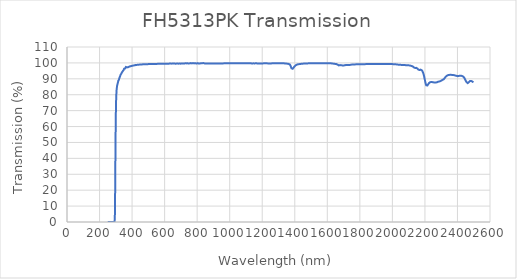
| Category | Transmission |
|---|---|
| 250.0 | 0.008 |
| 251.0 | 0.009 |
| 252.0 | 0.008 |
| 253.0 | 0.008 |
| 254.0 | 0.008 |
| 255.0 | 0.008 |
| 256.0 | 0.007 |
| 257.0 | 0.008 |
| 258.0 | 0.007 |
| 259.0 | 0.008 |
| 260.0 | 0.009 |
| 261.0 | 0.009 |
| 262.0 | 0.009 |
| 263.0 | 0.01 |
| 264.0 | 0.009 |
| 265.0 | 0.011 |
| 266.0 | 0.007 |
| 267.0 | 0.008 |
| 268.0 | 0.008 |
| 269.0 | 0.01 |
| 270.0 | 0.009 |
| 271.0 | 0.008 |
| 272.0 | 0.009 |
| 273.0 | 0.009 |
| 274.0 | 0.008 |
| 275.0 | 0.01 |
| 276.0 | 0.009 |
| 277.0 | 0.009 |
| 278.0 | 0.008 |
| 279.0 | 0.009 |
| 280.0 | 0.009 |
| 281.0 | 0.008 |
| 282.0 | 0.009 |
| 283.0 | 0.008 |
| 284.0 | 0.01 |
| 285.0 | 0.009 |
| 286.0 | 0.008 |
| 287.0 | 0.009 |
| 288.0 | 0.01 |
| 289.0 | 0.01 |
| 290.0 | 0.01 |
| 291.0 | 0.009 |
| 292.0 | 0.029 |
| 293.0 | 0.375 |
| 294.0 | 2.529 |
| 295.0 | 8.987 |
| 296.0 | 19.893 |
| 297.0 | 33.569 |
| 298.0 | 46.509 |
| 299.0 | 57.641 |
| 300.0 | 66.242 |
| 301.0 | 72.44 |
| 302.0 | 76.669 |
| 303.0 | 79.618 |
| 304.0 | 81.58 |
| 305.0 | 83.037 |
| 306.0 | 84.03 |
| 307.0 | 84.977 |
| 308.0 | 85.71 |
| 309.0 | 85.952 |
| 310.0 | 86.551 |
| 311.0 | 87 |
| 312.0 | 87.38 |
| 313.0 | 87.763 |
| 314.0 | 88.084 |
| 315.0 | 88.718 |
| 316.0 | 88.637 |
| 317.0 | 89.262 |
| 318.0 | 89.281 |
| 319.0 | 89.429 |
| 320.0 | 89.93 |
| 321.0 | 90.235 |
| 322.0 | 90.444 |
| 323.0 | 90.657 |
| 324.0 | 90.974 |
| 325.0 | 91.132 |
| 326.0 | 91.437 |
| 327.0 | 91.865 |
| 328.0 | 92.211 |
| 329.0 | 92.385 |
| 330.0 | 92.602 |
| 331.0 | 92.775 |
| 332.0 | 92.926 |
| 333.0 | 92.98 |
| 334.0 | 93.304 |
| 335.0 | 93.339 |
| 336.0 | 93.663 |
| 337.0 | 93.593 |
| 338.0 | 93.794 |
| 339.0 | 94.243 |
| 340.0 | 94.324 |
| 341.0 | 94.56 |
| 342.0 | 94.769 |
| 343.0 | 94.569 |
| 344.0 | 94.99 |
| 345.0 | 95.25 |
| 346.0 | 95.195 |
| 347.0 | 95.5 |
| 348.0 | 95.229 |
| 349.0 | 95.684 |
| 350.0 | 95.807 |
| 351.0 | 96.322 |
| 352.0 | 96.282 |
| 353.0 | 95.983 |
| 354.0 | 96.245 |
| 355.0 | 96.355 |
| 356.0 | 96.371 |
| 357.0 | 96.386 |
| 358.0 | 96.56 |
| 359.0 | 96.713 |
| 360.0 | 96.704 |
| 361.0 | 96.887 |
| 362.0 | 97.423 |
| 363.0 | 97.019 |
| 364.0 | 96.943 |
| 365.0 | 97.003 |
| 366.0 | 96.871 |
| 367.0 | 97.106 |
| 368.0 | 97.286 |
| 369.0 | 97.177 |
| 370.0 | 97.295 |
| 371.0 | 97.392 |
| 372.0 | 97.353 |
| 373.0 | 97.274 |
| 374.0 | 97.318 |
| 375.0 | 97.623 |
| 376.0 | 97.287 |
| 377.0 | 97.519 |
| 378.0 | 97.654 |
| 379.0 | 97.677 |
| 380.0 | 97.728 |
| 381.0 | 97.564 |
| 382.0 | 97.797 |
| 383.0 | 97.671 |
| 384.0 | 97.756 |
| 385.0 | 97.745 |
| 386.0 | 97.913 |
| 387.0 | 97.835 |
| 388.0 | 97.919 |
| 389.0 | 98.024 |
| 390.0 | 97.932 |
| 391.0 | 97.963 |
| 392.0 | 98.077 |
| 393.0 | 97.958 |
| 394.0 | 97.964 |
| 395.0 | 98.021 |
| 396.0 | 98.194 |
| 397.0 | 98.07 |
| 398.0 | 98.143 |
| 399.0 | 98.218 |
| 400.0 | 98.145 |
| 401.0 | 98.239 |
| 402.0 | 98.188 |
| 403.0 | 98.189 |
| 404.0 | 98.255 |
| 405.0 | 98.285 |
| 406.0 | 98.291 |
| 407.0 | 98.358 |
| 408.0 | 98.527 |
| 409.0 | 98.472 |
| 410.0 | 98.437 |
| 411.0 | 98.422 |
| 412.0 | 98.392 |
| 413.0 | 98.433 |
| 414.0 | 98.47 |
| 415.0 | 98.503 |
| 416.0 | 98.393 |
| 417.0 | 98.631 |
| 418.0 | 98.566 |
| 419.0 | 98.706 |
| 420.0 | 98.625 |
| 421.0 | 98.51 |
| 422.0 | 98.732 |
| 423.0 | 98.612 |
| 424.0 | 98.669 |
| 425.0 | 98.755 |
| 426.0 | 98.74 |
| 427.0 | 98.727 |
| 428.0 | 98.683 |
| 429.0 | 98.774 |
| 430.0 | 98.788 |
| 431.0 | 98.767 |
| 432.0 | 98.767 |
| 433.0 | 98.756 |
| 434.0 | 98.779 |
| 435.0 | 98.801 |
| 436.0 | 98.882 |
| 437.0 | 98.834 |
| 438.0 | 98.839 |
| 439.0 | 98.887 |
| 440.0 | 98.946 |
| 441.0 | 98.868 |
| 442.0 | 98.886 |
| 443.0 | 98.923 |
| 444.0 | 98.981 |
| 445.0 | 98.989 |
| 446.0 | 98.934 |
| 447.0 | 98.918 |
| 448.0 | 99.007 |
| 449.0 | 98.945 |
| 450.0 | 98.987 |
| 451.0 | 98.923 |
| 452.0 | 98.958 |
| 453.0 | 98.974 |
| 454.0 | 98.948 |
| 455.0 | 99.01 |
| 456.0 | 98.948 |
| 457.0 | 98.999 |
| 458.0 | 98.993 |
| 459.0 | 98.965 |
| 460.0 | 99.034 |
| 461.0 | 99.054 |
| 462.0 | 99.054 |
| 463.0 | 99.084 |
| 464.0 | 99.039 |
| 465.0 | 99.022 |
| 466.0 | 99.099 |
| 467.0 | 99.138 |
| 468.0 | 98.986 |
| 469.0 | 99.013 |
| 470.0 | 99.15 |
| 471.0 | 99.036 |
| 472.0 | 99.124 |
| 473.0 | 99.122 |
| 474.0 | 99.157 |
| 475.0 | 99.08 |
| 476.0 | 99.123 |
| 477.0 | 99.161 |
| 478.0 | 99.111 |
| 479.0 | 99.15 |
| 480.0 | 99.131 |
| 481.0 | 99.136 |
| 482.0 | 99.105 |
| 483.0 | 99.11 |
| 484.0 | 99.157 |
| 485.0 | 99.235 |
| 486.0 | 99.18 |
| 487.0 | 99.088 |
| 488.0 | 99.226 |
| 489.0 | 99.175 |
| 490.0 | 99.096 |
| 491.0 | 99.19 |
| 492.0 | 99.189 |
| 493.0 | 99.22 |
| 494.0 | 99.228 |
| 495.0 | 99.189 |
| 496.0 | 99.191 |
| 497.0 | 99.181 |
| 498.0 | 99.164 |
| 499.0 | 99.296 |
| 500.0 | 99.327 |
| 501.0 | 99.252 |
| 502.0 | 99.286 |
| 503.0 | 99.298 |
| 504.0 | 99.185 |
| 505.0 | 99.183 |
| 506.0 | 99.219 |
| 507.0 | 99.303 |
| 508.0 | 99.275 |
| 509.0 | 99.249 |
| 510.0 | 99.247 |
| 511.0 | 99.318 |
| 512.0 | 99.317 |
| 513.0 | 99.258 |
| 514.0 | 99.173 |
| 515.0 | 99.254 |
| 516.0 | 99.35 |
| 517.0 | 99.322 |
| 518.0 | 99.347 |
| 519.0 | 99.261 |
| 520.0 | 99.269 |
| 521.0 | 99.338 |
| 522.0 | 99.318 |
| 523.0 | 99.287 |
| 524.0 | 99.348 |
| 525.0 | 99.326 |
| 526.0 | 99.323 |
| 527.0 | 99.347 |
| 528.0 | 99.284 |
| 529.0 | 99.279 |
| 530.0 | 99.257 |
| 531.0 | 99.3 |
| 532.0 | 99.387 |
| 533.0 | 99.321 |
| 534.0 | 99.33 |
| 535.0 | 99.413 |
| 536.0 | 99.335 |
| 537.0 | 99.249 |
| 538.0 | 99.411 |
| 539.0 | 99.393 |
| 540.0 | 99.327 |
| 541.0 | 99.351 |
| 542.0 | 99.362 |
| 543.0 | 99.322 |
| 544.0 | 99.386 |
| 545.0 | 99.298 |
| 546.0 | 99.418 |
| 547.0 | 99.356 |
| 548.0 | 99.384 |
| 549.0 | 99.379 |
| 550.0 | 99.362 |
| 551.0 | 99.343 |
| 552.0 | 99.391 |
| 553.0 | 99.347 |
| 554.0 | 99.454 |
| 555.0 | 99.317 |
| 556.0 | 99.394 |
| 557.0 | 99.404 |
| 558.0 | 99.429 |
| 559.0 | 99.399 |
| 560.0 | 99.469 |
| 561.0 | 99.397 |
| 562.0 | 99.383 |
| 563.0 | 99.496 |
| 564.0 | 99.386 |
| 565.0 | 99.474 |
| 566.0 | 99.399 |
| 567.0 | 99.513 |
| 568.0 | 99.455 |
| 569.0 | 99.362 |
| 570.0 | 99.49 |
| 571.0 | 99.426 |
| 572.0 | 99.478 |
| 573.0 | 99.409 |
| 574.0 | 99.507 |
| 575.0 | 99.367 |
| 576.0 | 99.446 |
| 577.0 | 99.49 |
| 578.0 | 99.461 |
| 579.0 | 99.419 |
| 580.0 | 99.429 |
| 581.0 | 99.402 |
| 582.0 | 99.533 |
| 583.0 | 99.547 |
| 584.0 | 99.484 |
| 585.0 | 99.473 |
| 586.0 | 99.439 |
| 587.0 | 99.43 |
| 588.0 | 99.442 |
| 589.0 | 99.42 |
| 590.0 | 99.428 |
| 591.0 | 99.471 |
| 592.0 | 99.501 |
| 593.0 | 99.436 |
| 594.0 | 99.492 |
| 595.0 | 99.446 |
| 596.0 | 99.463 |
| 597.0 | 99.546 |
| 598.0 | 99.483 |
| 599.0 | 99.476 |
| 600.0 | 99.498 |
| 601.0 | 99.521 |
| 602.0 | 99.461 |
| 603.0 | 99.448 |
| 604.0 | 99.496 |
| 605.0 | 99.512 |
| 606.0 | 99.457 |
| 607.0 | 99.53 |
| 608.0 | 99.466 |
| 609.0 | 99.565 |
| 610.0 | 99.477 |
| 611.0 | 99.503 |
| 612.0 | 99.553 |
| 613.0 | 99.562 |
| 614.0 | 99.524 |
| 615.0 | 99.503 |
| 616.0 | 99.484 |
| 617.0 | 99.516 |
| 618.0 | 99.477 |
| 619.0 | 99.536 |
| 620.0 | 99.528 |
| 621.0 | 99.514 |
| 622.0 | 99.482 |
| 623.0 | 99.537 |
| 624.0 | 99.547 |
| 625.0 | 99.535 |
| 626.0 | 99.545 |
| 627.0 | 99.489 |
| 628.0 | 99.55 |
| 629.0 | 99.549 |
| 630.0 | 99.6 |
| 631.0 | 99.567 |
| 632.0 | 99.52 |
| 633.0 | 99.567 |
| 634.0 | 99.592 |
| 635.0 | 99.597 |
| 636.0 | 99.501 |
| 637.0 | 99.545 |
| 638.0 | 99.48 |
| 639.0 | 99.557 |
| 640.0 | 99.523 |
| 641.0 | 99.554 |
| 642.0 | 99.535 |
| 643.0 | 99.615 |
| 644.0 | 99.523 |
| 645.0 | 99.531 |
| 646.0 | 99.545 |
| 647.0 | 99.585 |
| 648.0 | 99.606 |
| 649.0 | 99.583 |
| 650.0 | 99.615 |
| 651.0 | 99.565 |
| 652.0 | 99.551 |
| 653.0 | 99.537 |
| 654.0 | 99.525 |
| 655.0 | 99.555 |
| 656.0 | 99.579 |
| 657.0 | 99.62 |
| 658.0 | 99.569 |
| 659.0 | 99.56 |
| 660.0 | 99.578 |
| 661.0 | 99.576 |
| 662.0 | 99.606 |
| 663.0 | 99.556 |
| 664.0 | 99.543 |
| 665.0 | 99.568 |
| 666.0 | 99.611 |
| 667.0 | 99.576 |
| 668.0 | 99.555 |
| 669.0 | 99.6 |
| 670.0 | 99.527 |
| 671.0 | 99.595 |
| 672.0 | 99.531 |
| 673.0 | 99.6 |
| 674.0 | 99.607 |
| 675.0 | 99.573 |
| 676.0 | 99.613 |
| 677.0 | 99.637 |
| 678.0 | 99.604 |
| 679.0 | 99.585 |
| 680.0 | 99.623 |
| 681.0 | 99.61 |
| 682.0 | 99.612 |
| 683.0 | 99.576 |
| 684.0 | 99.523 |
| 685.0 | 99.617 |
| 686.0 | 99.717 |
| 687.0 | 99.655 |
| 688.0 | 99.594 |
| 689.0 | 99.652 |
| 690.0 | 99.538 |
| 691.0 | 99.632 |
| 692.0 | 99.617 |
| 693.0 | 99.592 |
| 694.0 | 99.613 |
| 695.0 | 99.602 |
| 696.0 | 99.668 |
| 697.0 | 99.677 |
| 698.0 | 99.526 |
| 699.0 | 99.624 |
| 700.0 | 99.511 |
| 701.0 | 99.664 |
| 702.0 | 99.719 |
| 703.0 | 99.638 |
| 704.0 | 99.666 |
| 705.0 | 99.625 |
| 706.0 | 99.663 |
| 707.0 | 99.659 |
| 708.0 | 99.588 |
| 709.0 | 99.761 |
| 710.0 | 99.648 |
| 711.0 | 99.545 |
| 712.0 | 99.692 |
| 713.0 | 99.606 |
| 714.0 | 99.628 |
| 715.0 | 99.629 |
| 716.0 | 99.726 |
| 717.0 | 99.654 |
| 718.0 | 99.626 |
| 719.0 | 99.616 |
| 720.0 | 99.629 |
| 721.0 | 99.655 |
| 722.0 | 99.617 |
| 723.0 | 99.578 |
| 724.0 | 99.667 |
| 725.0 | 99.588 |
| 726.0 | 99.731 |
| 727.0 | 99.787 |
| 728.0 | 99.622 |
| 729.0 | 99.682 |
| 730.0 | 99.619 |
| 731.0 | 99.676 |
| 732.0 | 99.718 |
| 733.0 | 99.701 |
| 734.0 | 99.733 |
| 735.0 | 99.699 |
| 736.0 | 99.717 |
| 737.0 | 99.511 |
| 738.0 | 99.674 |
| 739.0 | 99.65 |
| 740.0 | 99.757 |
| 741.0 | 99.763 |
| 742.0 | 99.635 |
| 743.0 | 99.676 |
| 744.0 | 99.698 |
| 745.0 | 99.512 |
| 746.0 | 99.69 |
| 747.0 | 99.614 |
| 748.0 | 99.771 |
| 749.0 | 99.578 |
| 750.0 | 99.711 |
| 751.0 | 99.533 |
| 752.0 | 99.801 |
| 753.0 | 99.622 |
| 754.0 | 99.723 |
| 755.0 | 99.703 |
| 756.0 | 99.605 |
| 757.0 | 99.571 |
| 758.0 | 99.768 |
| 759.0 | 99.666 |
| 760.0 | 99.616 |
| 761.0 | 99.89 |
| 762.0 | 99.685 |
| 763.0 | 99.595 |
| 764.0 | 99.545 |
| 765.0 | 99.576 |
| 766.0 | 99.796 |
| 767.0 | 99.685 |
| 768.0 | 99.702 |
| 769.0 | 99.605 |
| 770.0 | 99.696 |
| 771.0 | 99.566 |
| 772.0 | 99.544 |
| 773.0 | 99.634 |
| 774.0 | 99.508 |
| 775.0 | 99.881 |
| 776.0 | 99.702 |
| 777.0 | 99.644 |
| 778.0 | 99.622 |
| 779.0 | 99.696 |
| 780.0 | 99.694 |
| 781.0 | 99.727 |
| 782.0 | 99.704 |
| 783.0 | 99.675 |
| 784.0 | 99.643 |
| 785.0 | 99.775 |
| 786.0 | 99.846 |
| 787.0 | 99.673 |
| 788.0 | 99.628 |
| 789.0 | 99.77 |
| 790.0 | 99.804 |
| 791.0 | 99.671 |
| 792.0 | 99.645 |
| 793.0 | 99.653 |
| 794.0 | 99.801 |
| 795.0 | 99.649 |
| 796.0 | 99.595 |
| 797.0 | 99.808 |
| 798.0 | 99.71 |
| 799.0 | 99.656 |
| 800.0 | 99.698 |
| 801.0 | 99.83 |
| 802.0 | 99.629 |
| 803.0 | 99.834 |
| 804.0 | 99.911 |
| 805.0 | 99.571 |
| 806.0 | 99.684 |
| 807.0 | 99.868 |
| 808.0 | 99.787 |
| 809.0 | 99.815 |
| 810.0 | 99.585 |
| 811.0 | 99.766 |
| 812.0 | 99.603 |
| 813.0 | 99.681 |
| 814.0 | 99.752 |
| 815.0 | 99.786 |
| 816.0 | 99.521 |
| 817.0 | 99.619 |
| 818.0 | 99.757 |
| 819.0 | 99.731 |
| 820.0 | 99.655 |
| 821.0 | 99.717 |
| 822.0 | 99.756 |
| 823.0 | 99.515 |
| 824.0 | 99.804 |
| 825.0 | 99.564 |
| 826.0 | 99.589 |
| 827.0 | 99.958 |
| 828.0 | 99.932 |
| 829.0 | 99.672 |
| 830.0 | 99.503 |
| 831.0 | 99.816 |
| 832.0 | 99.75 |
| 833.0 | 99.613 |
| 834.0 | 99.456 |
| 835.0 | 99.56 |
| 836.0 | 99.746 |
| 837.0 | 99.723 |
| 838.0 | 99.908 |
| 839.0 | 99.523 |
| 840.0 | 99.906 |
| 841.0 | 99.763 |
| 842.0 | 99.879 |
| 843.0 | 99.743 |
| 844.0 | 99.314 |
| 845.0 | 99.698 |
| 846.0 | 99.871 |
| 847.0 | 99.113 |
| 848.0 | 99.623 |
| 849.0 | 100.071 |
| 850.0 | 99.688 |
| 851.0 | 99.688 |
| 852.0 | 99.686 |
| 853.0 | 99.676 |
| 854.0 | 99.684 |
| 855.0 | 99.679 |
| 856.0 | 99.685 |
| 857.0 | 99.685 |
| 858.0 | 99.676 |
| 859.0 | 99.678 |
| 860.0 | 99.67 |
| 861.0 | 99.673 |
| 862.0 | 99.682 |
| 863.0 | 99.671 |
| 864.0 | 99.666 |
| 865.0 | 99.673 |
| 866.0 | 99.674 |
| 867.0 | 99.666 |
| 868.0 | 99.668 |
| 869.0 | 99.662 |
| 870.0 | 99.663 |
| 871.0 | 99.662 |
| 872.0 | 99.662 |
| 873.0 | 99.661 |
| 874.0 | 99.655 |
| 875.0 | 99.667 |
| 876.0 | 99.657 |
| 877.0 | 99.661 |
| 878.0 | 99.657 |
| 879.0 | 99.664 |
| 880.0 | 99.663 |
| 881.0 | 99.664 |
| 882.0 | 99.681 |
| 883.0 | 99.665 |
| 884.0 | 99.663 |
| 885.0 | 99.657 |
| 886.0 | 99.654 |
| 887.0 | 99.675 |
| 888.0 | 99.674 |
| 889.0 | 99.663 |
| 890.0 | 99.664 |
| 891.0 | 99.678 |
| 892.0 | 99.674 |
| 893.0 | 99.674 |
| 894.0 | 99.667 |
| 895.0 | 99.668 |
| 896.0 | 99.678 |
| 897.0 | 99.67 |
| 898.0 | 99.667 |
| 899.0 | 99.675 |
| 900.0 | 99.66 |
| 901.0 | 99.667 |
| 902.0 | 99.664 |
| 903.0 | 99.671 |
| 904.0 | 99.671 |
| 905.0 | 99.672 |
| 906.0 | 99.667 |
| 907.0 | 99.664 |
| 908.0 | 99.67 |
| 909.0 | 99.655 |
| 910.0 | 99.664 |
| 911.0 | 99.666 |
| 912.0 | 99.665 |
| 913.0 | 99.662 |
| 914.0 | 99.669 |
| 915.0 | 99.668 |
| 916.0 | 99.669 |
| 917.0 | 99.672 |
| 918.0 | 99.673 |
| 919.0 | 99.672 |
| 920.0 | 99.679 |
| 921.0 | 99.682 |
| 922.0 | 99.682 |
| 923.0 | 99.676 |
| 924.0 | 99.675 |
| 925.0 | 99.676 |
| 926.0 | 99.685 |
| 927.0 | 99.689 |
| 928.0 | 99.676 |
| 929.0 | 99.679 |
| 930.0 | 99.681 |
| 931.0 | 99.674 |
| 932.0 | 99.681 |
| 933.0 | 99.676 |
| 934.0 | 99.676 |
| 935.0 | 99.673 |
| 936.0 | 99.664 |
| 937.0 | 99.659 |
| 938.0 | 99.658 |
| 939.0 | 99.644 |
| 940.0 | 99.639 |
| 941.0 | 99.639 |
| 942.0 | 99.626 |
| 943.0 | 99.636 |
| 944.0 | 99.625 |
| 945.0 | 99.625 |
| 946.0 | 99.622 |
| 947.0 | 99.638 |
| 948.0 | 99.622 |
| 949.0 | 99.648 |
| 950.0 | 99.647 |
| 951.0 | 99.657 |
| 952.0 | 99.66 |
| 953.0 | 99.664 |
| 954.0 | 99.677 |
| 955.0 | 99.675 |
| 956.0 | 99.672 |
| 957.0 | 99.684 |
| 958.0 | 99.682 |
| 959.0 | 99.687 |
| 960.0 | 99.705 |
| 961.0 | 99.706 |
| 962.0 | 99.707 |
| 963.0 | 99.714 |
| 964.0 | 99.717 |
| 965.0 | 99.708 |
| 966.0 | 99.716 |
| 967.0 | 99.715 |
| 968.0 | 99.717 |
| 969.0 | 99.711 |
| 970.0 | 99.729 |
| 971.0 | 99.725 |
| 972.0 | 99.715 |
| 973.0 | 99.737 |
| 974.0 | 99.728 |
| 975.0 | 99.726 |
| 976.0 | 99.731 |
| 977.0 | 99.735 |
| 978.0 | 99.721 |
| 979.0 | 99.717 |
| 980.0 | 99.728 |
| 981.0 | 99.722 |
| 982.0 | 99.728 |
| 983.0 | 99.743 |
| 984.0 | 99.731 |
| 985.0 | 99.743 |
| 986.0 | 99.747 |
| 987.0 | 99.743 |
| 988.0 | 99.747 |
| 989.0 | 99.734 |
| 990.0 | 99.743 |
| 991.0 | 99.744 |
| 992.0 | 99.738 |
| 993.0 | 99.745 |
| 994.0 | 99.745 |
| 995.0 | 99.741 |
| 996.0 | 99.752 |
| 997.0 | 99.747 |
| 998.0 | 99.756 |
| 999.0 | 99.744 |
| 1000.0 | 99.738 |
| 1001.0 | 99.744 |
| 1002.0 | 99.735 |
| 1003.0 | 99.745 |
| 1004.0 | 99.75 |
| 1005.0 | 99.754 |
| 1006.0 | 99.753 |
| 1007.0 | 99.756 |
| 1008.0 | 99.757 |
| 1009.0 | 99.752 |
| 1010.0 | 99.751 |
| 1011.0 | 99.737 |
| 1012.0 | 99.74 |
| 1013.0 | 99.743 |
| 1014.0 | 99.735 |
| 1015.0 | 99.742 |
| 1016.0 | 99.752 |
| 1017.0 | 99.754 |
| 1018.0 | 99.761 |
| 1019.0 | 99.761 |
| 1020.0 | 99.753 |
| 1021.0 | 99.754 |
| 1022.0 | 99.741 |
| 1023.0 | 99.738 |
| 1024.0 | 99.753 |
| 1025.0 | 99.747 |
| 1026.0 | 99.747 |
| 1027.0 | 99.749 |
| 1028.0 | 99.757 |
| 1029.0 | 99.765 |
| 1030.0 | 99.76 |
| 1031.0 | 99.765 |
| 1032.0 | 99.753 |
| 1033.0 | 99.751 |
| 1034.0 | 99.746 |
| 1035.0 | 99.758 |
| 1036.0 | 99.753 |
| 1037.0 | 99.758 |
| 1038.0 | 99.757 |
| 1039.0 | 99.761 |
| 1040.0 | 99.771 |
| 1041.0 | 99.771 |
| 1042.0 | 99.778 |
| 1043.0 | 99.764 |
| 1044.0 | 99.764 |
| 1045.0 | 99.76 |
| 1046.0 | 99.765 |
| 1047.0 | 99.759 |
| 1048.0 | 99.756 |
| 1049.0 | 99.762 |
| 1050.0 | 99.761 |
| 1051.0 | 99.766 |
| 1052.0 | 99.767 |
| 1053.0 | 99.768 |
| 1054.0 | 99.783 |
| 1055.0 | 99.787 |
| 1056.0 | 99.783 |
| 1057.0 | 99.773 |
| 1058.0 | 99.76 |
| 1059.0 | 99.761 |
| 1060.0 | 99.768 |
| 1061.0 | 99.753 |
| 1062.0 | 99.771 |
| 1063.0 | 99.786 |
| 1064.0 | 99.787 |
| 1065.0 | 99.774 |
| 1066.0 | 99.791 |
| 1067.0 | 99.784 |
| 1068.0 | 99.783 |
| 1069.0 | 99.782 |
| 1070.0 | 99.782 |
| 1071.0 | 99.775 |
| 1072.0 | 99.771 |
| 1073.0 | 99.761 |
| 1074.0 | 99.775 |
| 1075.0 | 99.767 |
| 1076.0 | 99.79 |
| 1077.0 | 99.789 |
| 1078.0 | 99.802 |
| 1079.0 | 99.789 |
| 1080.0 | 99.802 |
| 1081.0 | 99.785 |
| 1082.0 | 99.775 |
| 1083.0 | 99.78 |
| 1084.0 | 99.767 |
| 1085.0 | 99.789 |
| 1086.0 | 99.784 |
| 1087.0 | 99.785 |
| 1088.0 | 99.791 |
| 1089.0 | 99.792 |
| 1090.0 | 99.797 |
| 1091.0 | 99.795 |
| 1092.0 | 99.808 |
| 1093.0 | 99.808 |
| 1094.0 | 99.804 |
| 1095.0 | 99.788 |
| 1096.0 | 99.783 |
| 1097.0 | 99.782 |
| 1098.0 | 99.779 |
| 1099.0 | 99.786 |
| 1100.0 | 99.783 |
| 1101.0 | 99.798 |
| 1102.0 | 99.792 |
| 1103.0 | 99.794 |
| 1104.0 | 99.791 |
| 1105.0 | 99.796 |
| 1106.0 | 99.81 |
| 1107.0 | 99.8 |
| 1108.0 | 99.793 |
| 1109.0 | 99.792 |
| 1110.0 | 99.791 |
| 1111.0 | 99.773 |
| 1112.0 | 99.766 |
| 1113.0 | 99.773 |
| 1114.0 | 99.78 |
| 1115.0 | 99.783 |
| 1116.0 | 99.782 |
| 1117.0 | 99.778 |
| 1118.0 | 99.786 |
| 1119.0 | 99.788 |
| 1120.0 | 99.781 |
| 1121.0 | 99.777 |
| 1122.0 | 99.77 |
| 1123.0 | 99.766 |
| 1124.0 | 99.749 |
| 1125.0 | 99.745 |
| 1126.0 | 99.733 |
| 1127.0 | 99.724 |
| 1128.0 | 99.72 |
| 1129.0 | 99.734 |
| 1130.0 | 99.725 |
| 1131.0 | 99.729 |
| 1132.0 | 99.715 |
| 1133.0 | 99.717 |
| 1134.0 | 99.701 |
| 1135.0 | 99.697 |
| 1136.0 | 99.687 |
| 1137.0 | 99.678 |
| 1138.0 | 99.671 |
| 1139.0 | 99.66 |
| 1140.0 | 99.662 |
| 1141.0 | 99.658 |
| 1142.0 | 99.662 |
| 1143.0 | 99.679 |
| 1144.0 | 99.687 |
| 1145.0 | 99.689 |
| 1146.0 | 99.712 |
| 1147.0 | 99.698 |
| 1148.0 | 99.693 |
| 1149.0 | 99.707 |
| 1150.0 | 99.695 |
| 1151.0 | 99.702 |
| 1152.0 | 99.707 |
| 1153.0 | 99.696 |
| 1154.0 | 99.69 |
| 1155.0 | 99.695 |
| 1156.0 | 99.698 |
| 1157.0 | 99.697 |
| 1158.0 | 99.709 |
| 1159.0 | 99.72 |
| 1160.0 | 99.72 |
| 1161.0 | 99.73 |
| 1162.0 | 99.719 |
| 1163.0 | 99.713 |
| 1164.0 | 99.714 |
| 1165.0 | 99.71 |
| 1166.0 | 99.705 |
| 1167.0 | 99.707 |
| 1168.0 | 99.698 |
| 1169.0 | 99.691 |
| 1170.0 | 99.685 |
| 1171.0 | 99.687 |
| 1172.0 | 99.687 |
| 1173.0 | 99.691 |
| 1174.0 | 99.701 |
| 1175.0 | 99.7 |
| 1176.0 | 99.698 |
| 1177.0 | 99.694 |
| 1178.0 | 99.697 |
| 1179.0 | 99.684 |
| 1180.0 | 99.675 |
| 1181.0 | 99.677 |
| 1182.0 | 99.672 |
| 1183.0 | 99.657 |
| 1184.0 | 99.641 |
| 1185.0 | 99.633 |
| 1186.0 | 99.635 |
| 1187.0 | 99.621 |
| 1188.0 | 99.633 |
| 1189.0 | 99.638 |
| 1190.0 | 99.647 |
| 1191.0 | 99.642 |
| 1192.0 | 99.645 |
| 1193.0 | 99.648 |
| 1194.0 | 99.659 |
| 1195.0 | 99.667 |
| 1196.0 | 99.669 |
| 1197.0 | 99.677 |
| 1198.0 | 99.659 |
| 1199.0 | 99.66 |
| 1200.0 | 99.669 |
| 1201.0 | 99.686 |
| 1202.0 | 99.68 |
| 1203.0 | 99.695 |
| 1204.0 | 99.693 |
| 1205.0 | 99.703 |
| 1206.0 | 99.711 |
| 1207.0 | 99.714 |
| 1208.0 | 99.713 |
| 1209.0 | 99.723 |
| 1210.0 | 99.725 |
| 1211.0 | 99.719 |
| 1212.0 | 99.721 |
| 1213.0 | 99.714 |
| 1214.0 | 99.713 |
| 1215.0 | 99.715 |
| 1216.0 | 99.72 |
| 1217.0 | 99.729 |
| 1218.0 | 99.709 |
| 1219.0 | 99.719 |
| 1220.0 | 99.719 |
| 1221.0 | 99.718 |
| 1222.0 | 99.734 |
| 1223.0 | 99.735 |
| 1224.0 | 99.739 |
| 1225.0 | 99.745 |
| 1226.0 | 99.752 |
| 1227.0 | 99.751 |
| 1228.0 | 99.737 |
| 1229.0 | 99.725 |
| 1230.0 | 99.722 |
| 1231.0 | 99.727 |
| 1232.0 | 99.718 |
| 1233.0 | 99.716 |
| 1234.0 | 99.685 |
| 1235.0 | 99.688 |
| 1236.0 | 99.679 |
| 1237.0 | 99.672 |
| 1238.0 | 99.681 |
| 1239.0 | 99.673 |
| 1240.0 | 99.665 |
| 1241.0 | 99.664 |
| 1242.0 | 99.643 |
| 1243.0 | 99.65 |
| 1244.0 | 99.645 |
| 1245.0 | 99.642 |
| 1246.0 | 99.644 |
| 1247.0 | 99.643 |
| 1248.0 | 99.637 |
| 1249.0 | 99.635 |
| 1250.0 | 99.632 |
| 1251.0 | 99.637 |
| 1252.0 | 99.652 |
| 1253.0 | 99.65 |
| 1254.0 | 99.682 |
| 1255.0 | 99.684 |
| 1256.0 | 99.693 |
| 1257.0 | 99.706 |
| 1258.0 | 99.707 |
| 1259.0 | 99.733 |
| 1260.0 | 99.73 |
| 1261.0 | 99.746 |
| 1262.0 | 99.754 |
| 1263.0 | 99.75 |
| 1264.0 | 99.749 |
| 1265.0 | 99.74 |
| 1266.0 | 99.744 |
| 1267.0 | 99.751 |
| 1268.0 | 99.758 |
| 1269.0 | 99.761 |
| 1270.0 | 99.758 |
| 1271.0 | 99.772 |
| 1272.0 | 99.771 |
| 1273.0 | 99.782 |
| 1274.0 | 99.774 |
| 1275.0 | 99.798 |
| 1276.0 | 99.808 |
| 1277.0 | 99.808 |
| 1278.0 | 99.804 |
| 1279.0 | 99.8 |
| 1280.0 | 99.802 |
| 1281.0 | 99.798 |
| 1282.0 | 99.8 |
| 1283.0 | 99.803 |
| 1284.0 | 99.798 |
| 1285.0 | 99.799 |
| 1286.0 | 99.795 |
| 1287.0 | 99.791 |
| 1288.0 | 99.789 |
| 1289.0 | 99.796 |
| 1290.0 | 99.799 |
| 1291.0 | 99.815 |
| 1292.0 | 99.816 |
| 1293.0 | 99.819 |
| 1294.0 | 99.824 |
| 1295.0 | 99.817 |
| 1296.0 | 99.829 |
| 1297.0 | 99.825 |
| 1298.0 | 99.828 |
| 1299.0 | 99.832 |
| 1300.0 | 99.825 |
| 1301.0 | 99.814 |
| 1302.0 | 99.808 |
| 1303.0 | 99.8 |
| 1304.0 | 99.797 |
| 1305.0 | 99.793 |
| 1306.0 | 99.808 |
| 1307.0 | 99.808 |
| 1308.0 | 99.802 |
| 1309.0 | 99.817 |
| 1310.0 | 99.81 |
| 1311.0 | 99.815 |
| 1312.0 | 99.816 |
| 1313.0 | 99.819 |
| 1314.0 | 99.825 |
| 1315.0 | 99.816 |
| 1316.0 | 99.812 |
| 1317.0 | 99.806 |
| 1318.0 | 99.794 |
| 1319.0 | 99.791 |
| 1320.0 | 99.79 |
| 1321.0 | 99.781 |
| 1322.0 | 99.774 |
| 1323.0 | 99.763 |
| 1324.0 | 99.759 |
| 1325.0 | 99.751 |
| 1326.0 | 99.751 |
| 1327.0 | 99.749 |
| 1328.0 | 99.744 |
| 1329.0 | 99.745 |
| 1330.0 | 99.749 |
| 1331.0 | 99.74 |
| 1332.0 | 99.732 |
| 1333.0 | 99.718 |
| 1334.0 | 99.715 |
| 1335.0 | 99.719 |
| 1336.0 | 99.707 |
| 1337.0 | 99.699 |
| 1338.0 | 99.675 |
| 1339.0 | 99.658 |
| 1340.0 | 99.641 |
| 1341.0 | 99.63 |
| 1342.0 | 99.626 |
| 1343.0 | 99.619 |
| 1344.0 | 99.612 |
| 1345.0 | 99.597 |
| 1346.0 | 99.584 |
| 1347.0 | 99.571 |
| 1348.0 | 99.571 |
| 1349.0 | 99.563 |
| 1350.0 | 99.562 |
| 1351.0 | 99.553 |
| 1352.0 | 99.552 |
| 1353.0 | 99.54 |
| 1354.0 | 99.521 |
| 1355.0 | 99.49 |
| 1356.0 | 99.486 |
| 1357.0 | 99.465 |
| 1358.0 | 99.462 |
| 1359.0 | 99.451 |
| 1360.0 | 99.432 |
| 1361.0 | 99.402 |
| 1362.0 | 99.366 |
| 1363.0 | 99.356 |
| 1364.0 | 99.333 |
| 1365.0 | 99.3 |
| 1366.0 | 99.264 |
| 1367.0 | 99.214 |
| 1368.0 | 99.148 |
| 1369.0 | 99.068 |
| 1370.0 | 98.971 |
| 1371.0 | 98.838 |
| 1372.0 | 98.67 |
| 1373.0 | 98.475 |
| 1374.0 | 98.225 |
| 1375.0 | 97.963 |
| 1376.0 | 97.666 |
| 1377.0 | 97.36 |
| 1378.0 | 97.06 |
| 1379.0 | 96.806 |
| 1380.0 | 96.591 |
| 1381.0 | 96.401 |
| 1382.0 | 96.274 |
| 1383.0 | 96.182 |
| 1384.0 | 96.142 |
| 1385.0 | 96.166 |
| 1386.0 | 96.23 |
| 1387.0 | 96.302 |
| 1388.0 | 96.407 |
| 1389.0 | 96.534 |
| 1390.0 | 96.659 |
| 1391.0 | 96.795 |
| 1392.0 | 96.929 |
| 1393.0 | 97.081 |
| 1394.0 | 97.213 |
| 1395.0 | 97.36 |
| 1396.0 | 97.498 |
| 1397.0 | 97.631 |
| 1398.0 | 97.764 |
| 1399.0 | 97.869 |
| 1400.0 | 97.981 |
| 1401.0 | 98.096 |
| 1402.0 | 98.198 |
| 1403.0 | 98.284 |
| 1404.0 | 98.363 |
| 1405.0 | 98.443 |
| 1406.0 | 98.502 |
| 1407.0 | 98.558 |
| 1408.0 | 98.637 |
| 1409.0 | 98.707 |
| 1410.0 | 98.772 |
| 1411.0 | 98.811 |
| 1412.0 | 98.871 |
| 1413.0 | 98.904 |
| 1414.0 | 98.929 |
| 1415.0 | 98.987 |
| 1416.0 | 99.023 |
| 1417.0 | 99.066 |
| 1418.0 | 99.083 |
| 1419.0 | 99.115 |
| 1420.0 | 99.125 |
| 1421.0 | 99.137 |
| 1422.0 | 99.152 |
| 1423.0 | 99.169 |
| 1424.0 | 99.192 |
| 1425.0 | 99.197 |
| 1426.0 | 99.208 |
| 1427.0 | 99.214 |
| 1428.0 | 99.225 |
| 1429.0 | 99.233 |
| 1430.0 | 99.248 |
| 1431.0 | 99.275 |
| 1432.0 | 99.292 |
| 1433.0 | 99.314 |
| 1434.0 | 99.324 |
| 1435.0 | 99.333 |
| 1436.0 | 99.35 |
| 1437.0 | 99.375 |
| 1438.0 | 99.386 |
| 1439.0 | 99.412 |
| 1440.0 | 99.429 |
| 1441.0 | 99.44 |
| 1442.0 | 99.448 |
| 1443.0 | 99.46 |
| 1444.0 | 99.458 |
| 1445.0 | 99.48 |
| 1446.0 | 99.491 |
| 1447.0 | 99.498 |
| 1448.0 | 99.514 |
| 1449.0 | 99.519 |
| 1450.0 | 99.516 |
| 1451.0 | 99.52 |
| 1452.0 | 99.528 |
| 1453.0 | 99.544 |
| 1454.0 | 99.563 |
| 1455.0 | 99.568 |
| 1456.0 | 99.582 |
| 1457.0 | 99.58 |
| 1458.0 | 99.586 |
| 1459.0 | 99.603 |
| 1460.0 | 99.604 |
| 1461.0 | 99.624 |
| 1462.0 | 99.639 |
| 1463.0 | 99.643 |
| 1464.0 | 99.652 |
| 1465.0 | 99.652 |
| 1466.0 | 99.652 |
| 1467.0 | 99.649 |
| 1468.0 | 99.658 |
| 1469.0 | 99.668 |
| 1470.0 | 99.675 |
| 1471.0 | 99.677 |
| 1472.0 | 99.672 |
| 1473.0 | 99.654 |
| 1474.0 | 99.669 |
| 1475.0 | 99.668 |
| 1476.0 | 99.67 |
| 1477.0 | 99.689 |
| 1478.0 | 99.691 |
| 1479.0 | 99.7 |
| 1480.0 | 99.699 |
| 1481.0 | 99.699 |
| 1482.0 | 99.71 |
| 1483.0 | 99.722 |
| 1484.0 | 99.73 |
| 1485.0 | 99.74 |
| 1486.0 | 99.744 |
| 1487.0 | 99.744 |
| 1488.0 | 99.74 |
| 1489.0 | 99.741 |
| 1490.0 | 99.747 |
| 1491.0 | 99.756 |
| 1492.0 | 99.772 |
| 1493.0 | 99.759 |
| 1494.0 | 99.756 |
| 1495.0 | 99.752 |
| 1496.0 | 99.744 |
| 1497.0 | 99.753 |
| 1498.0 | 99.758 |
| 1499.0 | 99.766 |
| 1500.0 | 99.779 |
| 1501.0 | 99.766 |
| 1502.0 | 99.766 |
| 1503.0 | 99.764 |
| 1504.0 | 99.763 |
| 1505.0 | 99.781 |
| 1506.0 | 99.786 |
| 1507.0 | 99.81 |
| 1508.0 | 99.81 |
| 1509.0 | 99.808 |
| 1510.0 | 99.804 |
| 1511.0 | 99.799 |
| 1512.0 | 99.806 |
| 1513.0 | 99.822 |
| 1514.0 | 99.832 |
| 1515.0 | 99.824 |
| 1516.0 | 99.822 |
| 1517.0 | 99.819 |
| 1518.0 | 99.799 |
| 1519.0 | 99.803 |
| 1520.0 | 99.816 |
| 1521.0 | 99.822 |
| 1522.0 | 99.823 |
| 1523.0 | 99.8 |
| 1524.0 | 99.8 |
| 1525.0 | 99.799 |
| 1526.0 | 99.803 |
| 1527.0 | 99.806 |
| 1528.0 | 99.819 |
| 1529.0 | 99.818 |
| 1530.0 | 99.819 |
| 1531.0 | 99.828 |
| 1532.0 | 99.817 |
| 1533.0 | 99.824 |
| 1534.0 | 99.841 |
| 1535.0 | 99.843 |
| 1536.0 | 99.85 |
| 1537.0 | 99.846 |
| 1538.0 | 99.842 |
| 1539.0 | 99.843 |
| 1540.0 | 99.83 |
| 1541.0 | 99.839 |
| 1542.0 | 99.834 |
| 1543.0 | 99.843 |
| 1544.0 | 99.854 |
| 1545.0 | 99.838 |
| 1546.0 | 99.828 |
| 1547.0 | 99.825 |
| 1548.0 | 99.808 |
| 1549.0 | 99.813 |
| 1550.0 | 99.825 |
| 1551.0 | 99.819 |
| 1552.0 | 99.824 |
| 1553.0 | 99.826 |
| 1554.0 | 99.822 |
| 1555.0 | 99.812 |
| 1556.0 | 99.822 |
| 1557.0 | 99.82 |
| 1558.0 | 99.834 |
| 1559.0 | 99.834 |
| 1560.0 | 99.833 |
| 1561.0 | 99.84 |
| 1562.0 | 99.835 |
| 1563.0 | 99.84 |
| 1564.0 | 99.835 |
| 1565.0 | 99.856 |
| 1566.0 | 99.849 |
| 1567.0 | 99.859 |
| 1568.0 | 99.847 |
| 1569.0 | 99.847 |
| 1570.0 | 99.835 |
| 1571.0 | 99.828 |
| 1572.0 | 99.834 |
| 1573.0 | 99.828 |
| 1574.0 | 99.828 |
| 1575.0 | 99.834 |
| 1576.0 | 99.817 |
| 1577.0 | 99.804 |
| 1578.0 | 99.804 |
| 1579.0 | 99.816 |
| 1580.0 | 99.816 |
| 1581.0 | 99.821 |
| 1582.0 | 99.821 |
| 1583.0 | 99.823 |
| 1584.0 | 99.817 |
| 1585.0 | 99.81 |
| 1586.0 | 99.823 |
| 1587.0 | 99.827 |
| 1588.0 | 99.84 |
| 1589.0 | 99.831 |
| 1590.0 | 99.829 |
| 1591.0 | 99.829 |
| 1592.0 | 99.826 |
| 1593.0 | 99.83 |
| 1594.0 | 99.822 |
| 1595.0 | 99.831 |
| 1596.0 | 99.831 |
| 1597.0 | 99.826 |
| 1598.0 | 99.813 |
| 1599.0 | 99.8 |
| 1600.0 | 99.804 |
| 1601.0 | 99.797 |
| 1602.0 | 99.799 |
| 1603.0 | 99.801 |
| 1604.0 | 99.786 |
| 1605.0 | 99.777 |
| 1606.0 | 99.78 |
| 1607.0 | 99.768 |
| 1608.0 | 99.779 |
| 1609.0 | 99.771 |
| 1610.0 | 99.777 |
| 1611.0 | 99.779 |
| 1612.0 | 99.772 |
| 1613.0 | 99.763 |
| 1614.0 | 99.761 |
| 1615.0 | 99.762 |
| 1616.0 | 99.755 |
| 1617.0 | 99.752 |
| 1618.0 | 99.768 |
| 1619.0 | 99.754 |
| 1620.0 | 99.744 |
| 1621.0 | 99.74 |
| 1622.0 | 99.735 |
| 1623.0 | 99.731 |
| 1624.0 | 99.722 |
| 1625.0 | 99.735 |
| 1626.0 | 99.718 |
| 1627.0 | 99.706 |
| 1628.0 | 99.687 |
| 1629.0 | 99.667 |
| 1630.0 | 99.645 |
| 1631.0 | 99.636 |
| 1632.0 | 99.63 |
| 1633.0 | 99.612 |
| 1634.0 | 99.603 |
| 1635.0 | 99.572 |
| 1636.0 | 99.557 |
| 1637.0 | 99.547 |
| 1638.0 | 99.536 |
| 1639.0 | 99.525 |
| 1640.0 | 99.518 |
| 1641.0 | 99.511 |
| 1642.0 | 99.479 |
| 1643.0 | 99.441 |
| 1644.0 | 99.418 |
| 1645.0 | 99.409 |
| 1646.0 | 99.376 |
| 1647.0 | 99.366 |
| 1648.0 | 99.348 |
| 1649.0 | 99.335 |
| 1650.0 | 99.33 |
| 1651.0 | 99.319 |
| 1652.0 | 99.315 |
| 1653.0 | 99.311 |
| 1654.0 | 99.311 |
| 1655.0 | 99.298 |
| 1656.0 | 99.282 |
| 1657.0 | 99.25 |
| 1658.0 | 99.209 |
| 1659.0 | 99.184 |
| 1660.0 | 99.133 |
| 1661.0 | 99.067 |
| 1662.0 | 99.011 |
| 1663.0 | 98.926 |
| 1664.0 | 98.837 |
| 1665.0 | 98.751 |
| 1666.0 | 98.677 |
| 1667.0 | 98.585 |
| 1668.0 | 98.524 |
| 1669.0 | 98.485 |
| 1670.0 | 98.444 |
| 1671.0 | 98.433 |
| 1672.0 | 98.438 |
| 1673.0 | 98.451 |
| 1674.0 | 98.489 |
| 1675.0 | 98.525 |
| 1676.0 | 98.564 |
| 1677.0 | 98.609 |
| 1678.0 | 98.636 |
| 1679.0 | 98.656 |
| 1680.0 | 98.653 |
| 1681.0 | 98.649 |
| 1682.0 | 98.636 |
| 1683.0 | 98.606 |
| 1684.0 | 98.569 |
| 1685.0 | 98.529 |
| 1686.0 | 98.487 |
| 1687.0 | 98.449 |
| 1688.0 | 98.413 |
| 1689.0 | 98.401 |
| 1690.0 | 98.401 |
| 1691.0 | 98.417 |
| 1692.0 | 98.43 |
| 1693.0 | 98.428 |
| 1694.0 | 98.425 |
| 1695.0 | 98.414 |
| 1696.0 | 98.388 |
| 1697.0 | 98.377 |
| 1698.0 | 98.367 |
| 1699.0 | 98.354 |
| 1700.0 | 98.354 |
| 1701.0 | 98.373 |
| 1702.0 | 98.385 |
| 1703.0 | 98.41 |
| 1704.0 | 98.437 |
| 1705.0 | 98.478 |
| 1706.0 | 98.514 |
| 1707.0 | 98.551 |
| 1708.0 | 98.577 |
| 1709.0 | 98.589 |
| 1710.0 | 98.608 |
| 1711.0 | 98.616 |
| 1712.0 | 98.635 |
| 1713.0 | 98.655 |
| 1714.0 | 98.655 |
| 1715.0 | 98.674 |
| 1716.0 | 98.668 |
| 1717.0 | 98.664 |
| 1718.0 | 98.659 |
| 1719.0 | 98.663 |
| 1720.0 | 98.662 |
| 1721.0 | 98.674 |
| 1722.0 | 98.682 |
| 1723.0 | 98.679 |
| 1724.0 | 98.686 |
| 1725.0 | 98.686 |
| 1726.0 | 98.694 |
| 1727.0 | 98.698 |
| 1728.0 | 98.702 |
| 1729.0 | 98.711 |
| 1730.0 | 98.707 |
| 1731.0 | 98.69 |
| 1732.0 | 98.695 |
| 1733.0 | 98.686 |
| 1734.0 | 98.687 |
| 1735.0 | 98.685 |
| 1736.0 | 98.693 |
| 1737.0 | 98.704 |
| 1738.0 | 98.721 |
| 1739.0 | 98.727 |
| 1740.0 | 98.74 |
| 1741.0 | 98.759 |
| 1742.0 | 98.778 |
| 1743.0 | 98.816 |
| 1744.0 | 98.828 |
| 1745.0 | 98.85 |
| 1746.0 | 98.878 |
| 1747.0 | 98.895 |
| 1748.0 | 98.913 |
| 1749.0 | 98.936 |
| 1750.0 | 98.961 |
| 1751.0 | 98.961 |
| 1752.0 | 98.983 |
| 1753.0 | 98.986 |
| 1754.0 | 98.983 |
| 1755.0 | 98.999 |
| 1756.0 | 99.006 |
| 1757.0 | 99.002 |
| 1758.0 | 99.023 |
| 1759.0 | 99.016 |
| 1760.0 | 99.017 |
| 1761.0 | 99.01 |
| 1762.0 | 99.004 |
| 1763.0 | 99.01 |
| 1764.0 | 99 |
| 1765.0 | 99 |
| 1766.0 | 99.015 |
| 1767.0 | 99.007 |
| 1768.0 | 99.01 |
| 1769.0 | 99.019 |
| 1770.0 | 99.016 |
| 1771.0 | 99.032 |
| 1772.0 | 99.04 |
| 1773.0 | 99.063 |
| 1774.0 | 99.08 |
| 1775.0 | 99.086 |
| 1776.0 | 99.112 |
| 1777.0 | 99.108 |
| 1778.0 | 99.125 |
| 1779.0 | 99.151 |
| 1780.0 | 99.134 |
| 1781.0 | 99.157 |
| 1782.0 | 99.163 |
| 1783.0 | 99.167 |
| 1784.0 | 99.159 |
| 1785.0 | 99.171 |
| 1786.0 | 99.165 |
| 1787.0 | 99.17 |
| 1788.0 | 99.181 |
| 1789.0 | 99.181 |
| 1790.0 | 99.178 |
| 1791.0 | 99.17 |
| 1792.0 | 99.179 |
| 1793.0 | 99.182 |
| 1794.0 | 99.184 |
| 1795.0 | 99.186 |
| 1796.0 | 99.187 |
| 1797.0 | 99.182 |
| 1798.0 | 99.18 |
| 1799.0 | 99.181 |
| 1800.0 | 99.201 |
| 1801.0 | 99.186 |
| 1802.0 | 99.194 |
| 1803.0 | 99.199 |
| 1804.0 | 99.212 |
| 1805.0 | 99.213 |
| 1806.0 | 99.205 |
| 1807.0 | 99.212 |
| 1808.0 | 99.209 |
| 1809.0 | 99.213 |
| 1810.0 | 99.226 |
| 1811.0 | 99.226 |
| 1812.0 | 99.237 |
| 1813.0 | 99.229 |
| 1814.0 | 99.226 |
| 1815.0 | 99.232 |
| 1816.0 | 99.233 |
| 1817.0 | 99.237 |
| 1818.0 | 99.233 |
| 1819.0 | 99.236 |
| 1820.0 | 99.242 |
| 1821.0 | 99.243 |
| 1822.0 | 99.239 |
| 1823.0 | 99.228 |
| 1824.0 | 99.226 |
| 1825.0 | 99.224 |
| 1826.0 | 99.219 |
| 1827.0 | 99.218 |
| 1828.0 | 99.227 |
| 1829.0 | 99.204 |
| 1830.0 | 99.22 |
| 1831.0 | 99.219 |
| 1832.0 | 99.213 |
| 1833.0 | 99.224 |
| 1834.0 | 99.24 |
| 1835.0 | 99.214 |
| 1836.0 | 99.227 |
| 1837.0 | 99.237 |
| 1838.0 | 99.232 |
| 1839.0 | 99.268 |
| 1840.0 | 99.245 |
| 1841.0 | 99.253 |
| 1842.0 | 99.261 |
| 1843.0 | 99.268 |
| 1844.0 | 99.267 |
| 1845.0 | 99.274 |
| 1846.0 | 99.287 |
| 1847.0 | 99.301 |
| 1848.0 | 99.293 |
| 1849.0 | 99.31 |
| 1850.0 | 99.309 |
| 1851.0 | 99.318 |
| 1852.0 | 99.323 |
| 1853.0 | 99.317 |
| 1854.0 | 99.32 |
| 1855.0 | 99.319 |
| 1856.0 | 99.32 |
| 1857.0 | 99.323 |
| 1858.0 | 99.314 |
| 1859.0 | 99.314 |
| 1860.0 | 99.313 |
| 1861.0 | 99.312 |
| 1862.0 | 99.313 |
| 1863.0 | 99.316 |
| 1864.0 | 99.313 |
| 1865.0 | 99.302 |
| 1866.0 | 99.307 |
| 1867.0 | 99.297 |
| 1868.0 | 99.302 |
| 1869.0 | 99.292 |
| 1870.0 | 99.291 |
| 1871.0 | 99.296 |
| 1872.0 | 99.294 |
| 1873.0 | 99.288 |
| 1874.0 | 99.283 |
| 1875.0 | 99.298 |
| 1876.0 | 99.294 |
| 1877.0 | 99.306 |
| 1878.0 | 99.301 |
| 1879.0 | 99.306 |
| 1880.0 | 99.311 |
| 1881.0 | 99.317 |
| 1882.0 | 99.312 |
| 1883.0 | 99.316 |
| 1884.0 | 99.309 |
| 1885.0 | 99.312 |
| 1886.0 | 99.323 |
| 1887.0 | 99.31 |
| 1888.0 | 99.309 |
| 1889.0 | 99.314 |
| 1890.0 | 99.313 |
| 1891.0 | 99.318 |
| 1892.0 | 99.311 |
| 1893.0 | 99.31 |
| 1894.0 | 99.305 |
| 1895.0 | 99.311 |
| 1896.0 | 99.306 |
| 1897.0 | 99.308 |
| 1898.0 | 99.293 |
| 1899.0 | 99.295 |
| 1900.0 | 99.297 |
| 1901.0 | 99.287 |
| 1902.0 | 99.277 |
| 1903.0 | 99.274 |
| 1904.0 | 99.258 |
| 1905.0 | 99.278 |
| 1906.0 | 99.244 |
| 1907.0 | 99.267 |
| 1908.0 | 99.251 |
| 1909.0 | 99.247 |
| 1910.0 | 99.248 |
| 1911.0 | 99.24 |
| 1912.0 | 99.256 |
| 1913.0 | 99.237 |
| 1914.0 | 99.25 |
| 1915.0 | 99.243 |
| 1916.0 | 99.247 |
| 1917.0 | 99.252 |
| 1918.0 | 99.252 |
| 1919.0 | 99.252 |
| 1920.0 | 99.247 |
| 1921.0 | 99.263 |
| 1922.0 | 99.266 |
| 1923.0 | 99.27 |
| 1924.0 | 99.26 |
| 1925.0 | 99.28 |
| 1926.0 | 99.275 |
| 1927.0 | 99.288 |
| 1928.0 | 99.285 |
| 1929.0 | 99.296 |
| 1930.0 | 99.293 |
| 1931.0 | 99.305 |
| 1932.0 | 99.292 |
| 1933.0 | 99.292 |
| 1934.0 | 99.296 |
| 1935.0 | 99.297 |
| 1936.0 | 99.3 |
| 1937.0 | 99.298 |
| 1938.0 | 99.301 |
| 1939.0 | 99.3 |
| 1940.0 | 99.302 |
| 1941.0 | 99.303 |
| 1942.0 | 99.306 |
| 1943.0 | 99.305 |
| 1944.0 | 99.302 |
| 1945.0 | 99.297 |
| 1946.0 | 99.3 |
| 1947.0 | 99.293 |
| 1948.0 | 99.303 |
| 1949.0 | 99.317 |
| 1950.0 | 99.304 |
| 1951.0 | 99.299 |
| 1952.0 | 99.301 |
| 1953.0 | 99.302 |
| 1954.0 | 99.306 |
| 1955.0 | 99.307 |
| 1956.0 | 99.31 |
| 1957.0 | 99.317 |
| 1958.0 | 99.304 |
| 1959.0 | 99.314 |
| 1960.0 | 99.314 |
| 1961.0 | 99.317 |
| 1962.0 | 99.319 |
| 1963.0 | 99.328 |
| 1964.0 | 99.327 |
| 1965.0 | 99.322 |
| 1966.0 | 99.327 |
| 1967.0 | 99.328 |
| 1968.0 | 99.34 |
| 1969.0 | 99.33 |
| 1970.0 | 99.333 |
| 1971.0 | 99.335 |
| 1972.0 | 99.337 |
| 1973.0 | 99.338 |
| 1974.0 | 99.334 |
| 1975.0 | 99.327 |
| 1976.0 | 99.346 |
| 1977.0 | 99.326 |
| 1978.0 | 99.344 |
| 1979.0 | 99.33 |
| 1980.0 | 99.334 |
| 1981.0 | 99.329 |
| 1982.0 | 99.328 |
| 1983.0 | 99.319 |
| 1984.0 | 99.316 |
| 1985.0 | 99.323 |
| 1986.0 | 99.314 |
| 1987.0 | 99.306 |
| 1988.0 | 99.315 |
| 1989.0 | 99.299 |
| 1990.0 | 99.296 |
| 1991.0 | 99.289 |
| 1992.0 | 99.284 |
| 1993.0 | 99.278 |
| 1994.0 | 99.273 |
| 1995.0 | 99.266 |
| 1996.0 | 99.265 |
| 1997.0 | 99.254 |
| 1998.0 | 99.256 |
| 1999.0 | 99.25 |
| 2000.0 | 99.252 |
| 2001.0 | 99.243 |
| 2002.0 | 99.233 |
| 2003.0 | 99.232 |
| 2004.0 | 99.226 |
| 2005.0 | 99.219 |
| 2006.0 | 99.222 |
| 2007.0 | 99.205 |
| 2008.0 | 99.21 |
| 2009.0 | 99.201 |
| 2010.0 | 99.197 |
| 2011.0 | 99.189 |
| 2012.0 | 99.177 |
| 2013.0 | 99.176 |
| 2014.0 | 99.168 |
| 2015.0 | 99.162 |
| 2016.0 | 99.152 |
| 2017.0 | 99.149 |
| 2018.0 | 99.139 |
| 2019.0 | 99.136 |
| 2020.0 | 99.118 |
| 2021.0 | 99.116 |
| 2022.0 | 99.091 |
| 2023.0 | 99.091 |
| 2024.0 | 99.078 |
| 2025.0 | 99.058 |
| 2026.0 | 99.047 |
| 2027.0 | 99.038 |
| 2028.0 | 99.019 |
| 2029.0 | 99.008 |
| 2030.0 | 98.978 |
| 2031.0 | 98.977 |
| 2032.0 | 98.956 |
| 2033.0 | 98.958 |
| 2034.0 | 98.924 |
| 2035.0 | 98.913 |
| 2036.0 | 98.904 |
| 2037.0 | 98.883 |
| 2038.0 | 98.875 |
| 2039.0 | 98.868 |
| 2040.0 | 98.854 |
| 2041.0 | 98.842 |
| 2042.0 | 98.838 |
| 2043.0 | 98.816 |
| 2044.0 | 98.817 |
| 2045.0 | 98.804 |
| 2046.0 | 98.798 |
| 2047.0 | 98.787 |
| 2048.0 | 98.787 |
| 2049.0 | 98.777 |
| 2050.0 | 98.777 |
| 2051.0 | 98.771 |
| 2052.0 | 98.762 |
| 2053.0 | 98.763 |
| 2054.0 | 98.754 |
| 2055.0 | 98.762 |
| 2056.0 | 98.749 |
| 2057.0 | 98.743 |
| 2058.0 | 98.744 |
| 2059.0 | 98.728 |
| 2060.0 | 98.739 |
| 2061.0 | 98.723 |
| 2062.0 | 98.728 |
| 2063.0 | 98.715 |
| 2064.0 | 98.712 |
| 2065.0 | 98.698 |
| 2066.0 | 98.704 |
| 2067.0 | 98.695 |
| 2068.0 | 98.676 |
| 2069.0 | 98.681 |
| 2070.0 | 98.67 |
| 2071.0 | 98.666 |
| 2072.0 | 98.659 |
| 2073.0 | 98.65 |
| 2074.0 | 98.644 |
| 2075.0 | 98.634 |
| 2076.0 | 98.621 |
| 2077.0 | 98.622 |
| 2078.0 | 98.62 |
| 2079.0 | 98.603 |
| 2080.0 | 98.605 |
| 2081.0 | 98.592 |
| 2082.0 | 98.59 |
| 2083.0 | 98.579 |
| 2084.0 | 98.582 |
| 2085.0 | 98.575 |
| 2086.0 | 98.563 |
| 2087.0 | 98.566 |
| 2088.0 | 98.553 |
| 2089.0 | 98.544 |
| 2090.0 | 98.54 |
| 2091.0 | 98.544 |
| 2092.0 | 98.526 |
| 2093.0 | 98.534 |
| 2094.0 | 98.518 |
| 2095.0 | 98.526 |
| 2096.0 | 98.504 |
| 2097.0 | 98.508 |
| 2098.0 | 98.493 |
| 2099.0 | 98.5 |
| 2100.0 | 98.467 |
| 2101.0 | 98.464 |
| 2102.0 | 98.457 |
| 2103.0 | 98.444 |
| 2104.0 | 98.422 |
| 2105.0 | 98.416 |
| 2106.0 | 98.388 |
| 2107.0 | 98.372 |
| 2108.0 | 98.347 |
| 2109.0 | 98.318 |
| 2110.0 | 98.295 |
| 2111.0 | 98.271 |
| 2112.0 | 98.246 |
| 2113.0 | 98.224 |
| 2114.0 | 98.185 |
| 2115.0 | 98.167 |
| 2116.0 | 98.125 |
| 2117.0 | 98.101 |
| 2118.0 | 98.07 |
| 2119.0 | 98.043 |
| 2120.0 | 98.008 |
| 2121.0 | 97.965 |
| 2122.0 | 97.925 |
| 2123.0 | 97.884 |
| 2124.0 | 97.836 |
| 2125.0 | 97.786 |
| 2126.0 | 97.709 |
| 2127.0 | 97.642 |
| 2128.0 | 97.557 |
| 2129.0 | 97.472 |
| 2130.0 | 97.38 |
| 2131.0 | 97.282 |
| 2132.0 | 97.191 |
| 2133.0 | 97.103 |
| 2134.0 | 97.032 |
| 2135.0 | 96.965 |
| 2136.0 | 96.905 |
| 2137.0 | 96.872 |
| 2138.0 | 96.851 |
| 2139.0 | 96.834 |
| 2140.0 | 96.84 |
| 2141.0 | 96.846 |
| 2142.0 | 96.866 |
| 2143.0 | 96.873 |
| 2144.0 | 96.887 |
| 2145.0 | 96.893 |
| 2146.0 | 96.89 |
| 2147.0 | 96.887 |
| 2148.0 | 96.857 |
| 2149.0 | 96.824 |
| 2150.0 | 96.78 |
| 2151.0 | 96.715 |
| 2152.0 | 96.634 |
| 2153.0 | 96.542 |
| 2154.0 | 96.449 |
| 2155.0 | 96.337 |
| 2156.0 | 96.224 |
| 2157.0 | 96.101 |
| 2158.0 | 95.982 |
| 2159.0 | 95.873 |
| 2160.0 | 95.764 |
| 2161.0 | 95.675 |
| 2162.0 | 95.602 |
| 2163.0 | 95.545 |
| 2164.0 | 95.51 |
| 2165.0 | 95.49 |
| 2166.0 | 95.492 |
| 2167.0 | 95.513 |
| 2168.0 | 95.545 |
| 2169.0 | 95.588 |
| 2170.0 | 95.642 |
| 2171.0 | 95.687 |
| 2172.0 | 95.721 |
| 2173.0 | 95.748 |
| 2174.0 | 95.764 |
| 2175.0 | 95.766 |
| 2176.0 | 95.736 |
| 2177.0 | 95.701 |
| 2178.0 | 95.639 |
| 2179.0 | 95.557 |
| 2180.0 | 95.463 |
| 2181.0 | 95.352 |
| 2182.0 | 95.214 |
| 2183.0 | 95.059 |
| 2184.0 | 94.894 |
| 2185.0 | 94.713 |
| 2186.0 | 94.504 |
| 2187.0 | 94.269 |
| 2188.0 | 94.014 |
| 2189.0 | 93.752 |
| 2190.0 | 93.449 |
| 2191.0 | 93.133 |
| 2192.0 | 92.783 |
| 2193.0 | 92.389 |
| 2194.0 | 91.996 |
| 2195.0 | 91.555 |
| 2196.0 | 91.092 |
| 2197.0 | 90.62 |
| 2198.0 | 90.116 |
| 2199.0 | 89.608 |
| 2200.0 | 89.084 |
| 2201.0 | 88.603 |
| 2202.0 | 88.095 |
| 2203.0 | 87.634 |
| 2204.0 | 87.195 |
| 2205.0 | 86.802 |
| 2206.0 | 86.458 |
| 2207.0 | 86.176 |
| 2208.0 | 85.955 |
| 2209.0 | 85.775 |
| 2210.0 | 85.661 |
| 2211.0 | 85.597 |
| 2212.0 | 85.58 |
| 2213.0 | 85.614 |
| 2214.0 | 85.694 |
| 2215.0 | 85.798 |
| 2216.0 | 85.939 |
| 2217.0 | 86.08 |
| 2218.0 | 86.242 |
| 2219.0 | 86.412 |
| 2220.0 | 86.578 |
| 2221.0 | 86.752 |
| 2222.0 | 86.909 |
| 2223.0 | 87.055 |
| 2224.0 | 87.195 |
| 2225.0 | 87.317 |
| 2226.0 | 87.422 |
| 2227.0 | 87.526 |
| 2228.0 | 87.605 |
| 2229.0 | 87.685 |
| 2230.0 | 87.754 |
| 2231.0 | 87.81 |
| 2232.0 | 87.856 |
| 2233.0 | 87.902 |
| 2234.0 | 87.923 |
| 2235.0 | 87.95 |
| 2236.0 | 87.974 |
| 2237.0 | 87.996 |
| 2238.0 | 88.005 |
| 2239.0 | 88.01 |
| 2240.0 | 88.012 |
| 2241.0 | 87.99 |
| 2242.0 | 87.983 |
| 2243.0 | 87.973 |
| 2244.0 | 87.954 |
| 2245.0 | 87.926 |
| 2246.0 | 87.917 |
| 2247.0 | 87.887 |
| 2248.0 | 87.858 |
| 2249.0 | 87.833 |
| 2250.0 | 87.813 |
| 2251.0 | 87.791 |
| 2252.0 | 87.777 |
| 2253.0 | 87.764 |
| 2254.0 | 87.749 |
| 2255.0 | 87.732 |
| 2256.0 | 87.724 |
| 2257.0 | 87.711 |
| 2258.0 | 87.715 |
| 2259.0 | 87.698 |
| 2260.0 | 87.71 |
| 2261.0 | 87.72 |
| 2262.0 | 87.704 |
| 2263.0 | 87.702 |
| 2264.0 | 87.693 |
| 2265.0 | 87.696 |
| 2266.0 | 87.703 |
| 2267.0 | 87.703 |
| 2268.0 | 87.708 |
| 2269.0 | 87.719 |
| 2270.0 | 87.733 |
| 2271.0 | 87.754 |
| 2272.0 | 87.78 |
| 2273.0 | 87.811 |
| 2274.0 | 87.847 |
| 2275.0 | 87.889 |
| 2276.0 | 87.932 |
| 2277.0 | 87.977 |
| 2278.0 | 88.025 |
| 2279.0 | 88.069 |
| 2280.0 | 88.111 |
| 2281.0 | 88.156 |
| 2282.0 | 88.194 |
| 2283.0 | 88.216 |
| 2284.0 | 88.253 |
| 2285.0 | 88.278 |
| 2286.0 | 88.3 |
| 2287.0 | 88.316 |
| 2288.0 | 88.341 |
| 2289.0 | 88.359 |
| 2290.0 | 88.38 |
| 2291.0 | 88.401 |
| 2292.0 | 88.423 |
| 2293.0 | 88.448 |
| 2294.0 | 88.498 |
| 2295.0 | 88.537 |
| 2296.0 | 88.585 |
| 2297.0 | 88.637 |
| 2298.0 | 88.677 |
| 2299.0 | 88.732 |
| 2300.0 | 88.803 |
| 2301.0 | 88.876 |
| 2302.0 | 88.945 |
| 2303.0 | 89.011 |
| 2304.0 | 89.074 |
| 2305.0 | 89.138 |
| 2306.0 | 89.203 |
| 2307.0 | 89.268 |
| 2308.0 | 89.317 |
| 2309.0 | 89.365 |
| 2310.0 | 89.408 |
| 2311.0 | 89.453 |
| 2312.0 | 89.492 |
| 2313.0 | 89.546 |
| 2314.0 | 89.602 |
| 2315.0 | 89.683 |
| 2316.0 | 89.766 |
| 2317.0 | 89.874 |
| 2318.0 | 89.997 |
| 2319.0 | 90.112 |
| 2320.0 | 90.26 |
| 2321.0 | 90.388 |
| 2322.0 | 90.553 |
| 2323.0 | 90.695 |
| 2324.0 | 90.82 |
| 2325.0 | 90.948 |
| 2326.0 | 91.061 |
| 2327.0 | 91.188 |
| 2328.0 | 91.289 |
| 2329.0 | 91.386 |
| 2330.0 | 91.489 |
| 2331.0 | 91.577 |
| 2332.0 | 91.659 |
| 2333.0 | 91.77 |
| 2334.0 | 91.845 |
| 2335.0 | 91.922 |
| 2336.0 | 92.015 |
| 2337.0 | 92.077 |
| 2338.0 | 92.151 |
| 2339.0 | 92.203 |
| 2340.0 | 92.257 |
| 2341.0 | 92.28 |
| 2342.0 | 92.339 |
| 2343.0 | 92.372 |
| 2344.0 | 92.38 |
| 2345.0 | 92.416 |
| 2346.0 | 92.422 |
| 2347.0 | 92.434 |
| 2348.0 | 92.446 |
| 2349.0 | 92.463 |
| 2350.0 | 92.465 |
| 2351.0 | 92.483 |
| 2352.0 | 92.493 |
| 2353.0 | 92.506 |
| 2354.0 | 92.518 |
| 2355.0 | 92.528 |
| 2356.0 | 92.538 |
| 2357.0 | 92.549 |
| 2358.0 | 92.545 |
| 2359.0 | 92.537 |
| 2360.0 | 92.537 |
| 2361.0 | 92.511 |
| 2362.0 | 92.5 |
| 2363.0 | 92.48 |
| 2364.0 | 92.467 |
| 2365.0 | 92.455 |
| 2366.0 | 92.44 |
| 2367.0 | 92.429 |
| 2368.0 | 92.418 |
| 2369.0 | 92.403 |
| 2370.0 | 92.389 |
| 2371.0 | 92.392 |
| 2372.0 | 92.366 |
| 2373.0 | 92.37 |
| 2374.0 | 92.362 |
| 2375.0 | 92.35 |
| 2376.0 | 92.347 |
| 2377.0 | 92.325 |
| 2378.0 | 92.313 |
| 2379.0 | 92.304 |
| 2380.0 | 92.283 |
| 2381.0 | 92.262 |
| 2382.0 | 92.233 |
| 2383.0 | 92.198 |
| 2384.0 | 92.166 |
| 2385.0 | 92.141 |
| 2386.0 | 92.103 |
| 2387.0 | 92.068 |
| 2388.0 | 92.03 |
| 2389.0 | 92 |
| 2390.0 | 91.971 |
| 2391.0 | 91.936 |
| 2392.0 | 91.914 |
| 2393.0 | 91.879 |
| 2394.0 | 91.851 |
| 2395.0 | 91.82 |
| 2396.0 | 91.784 |
| 2397.0 | 91.768 |
| 2398.0 | 91.73 |
| 2399.0 | 91.709 |
| 2400.0 | 91.686 |
| 2401.0 | 91.667 |
| 2402.0 | 91.661 |
| 2403.0 | 91.66 |
| 2404.0 | 91.669 |
| 2405.0 | 91.682 |
| 2406.0 | 91.712 |
| 2407.0 | 91.741 |
| 2408.0 | 91.775 |
| 2409.0 | 91.817 |
| 2410.0 | 91.848 |
| 2411.0 | 91.876 |
| 2412.0 | 91.913 |
| 2413.0 | 91.934 |
| 2414.0 | 91.946 |
| 2415.0 | 91.955 |
| 2416.0 | 91.961 |
| 2417.0 | 91.965 |
| 2418.0 | 91.959 |
| 2419.0 | 91.951 |
| 2420.0 | 91.942 |
| 2421.0 | 91.942 |
| 2422.0 | 91.921 |
| 2423.0 | 91.909 |
| 2424.0 | 91.886 |
| 2425.0 | 91.867 |
| 2426.0 | 91.85 |
| 2427.0 | 91.822 |
| 2428.0 | 91.806 |
| 2429.0 | 91.754 |
| 2430.0 | 91.728 |
| 2431.0 | 91.69 |
| 2432.0 | 91.645 |
| 2433.0 | 91.588 |
| 2434.0 | 91.514 |
| 2435.0 | 91.454 |
| 2436.0 | 91.363 |
| 2437.0 | 91.267 |
| 2438.0 | 91.161 |
| 2439.0 | 91.037 |
| 2440.0 | 90.91 |
| 2441.0 | 90.769 |
| 2442.0 | 90.602 |
| 2443.0 | 90.424 |
| 2444.0 | 90.26 |
| 2445.0 | 90.058 |
| 2446.0 | 89.85 |
| 2447.0 | 89.657 |
| 2448.0 | 89.449 |
| 2449.0 | 89.242 |
| 2450.0 | 89.027 |
| 2451.0 | 88.826 |
| 2452.0 | 88.624 |
| 2453.0 | 88.43 |
| 2454.0 | 88.242 |
| 2455.0 | 88.056 |
| 2456.0 | 87.883 |
| 2457.0 | 87.734 |
| 2458.0 | 87.588 |
| 2459.0 | 87.475 |
| 2460.0 | 87.384 |
| 2461.0 | 87.332 |
| 2462.0 | 87.298 |
| 2463.0 | 87.297 |
| 2464.0 | 87.333 |
| 2465.0 | 87.389 |
| 2466.0 | 87.467 |
| 2467.0 | 87.564 |
| 2468.0 | 87.676 |
| 2469.0 | 87.792 |
| 2470.0 | 87.915 |
| 2471.0 | 88.039 |
| 2472.0 | 88.152 |
| 2473.0 | 88.262 |
| 2474.0 | 88.371 |
| 2475.0 | 88.456 |
| 2476.0 | 88.534 |
| 2477.0 | 88.602 |
| 2478.0 | 88.647 |
| 2479.0 | 88.69 |
| 2480.0 | 88.707 |
| 2481.0 | 88.72 |
| 2482.0 | 88.704 |
| 2483.0 | 88.691 |
| 2484.0 | 88.661 |
| 2485.0 | 88.624 |
| 2486.0 | 88.578 |
| 2487.0 | 88.529 |
| 2488.0 | 88.474 |
| 2489.0 | 88.413 |
| 2490.0 | 88.351 |
| 2491.0 | 88.283 |
| 2492.0 | 88.211 |
| 2493.0 | 88.151 |
| 2494.0 | 88.082 |
| 2495.0 | 88.013 |
| 2496.0 | 87.94 |
| 2497.0 | 87.874 |
| 2498.0 | 87.786 |
| 2499.0 | 87.716 |
| 2500.0 | 87.63 |